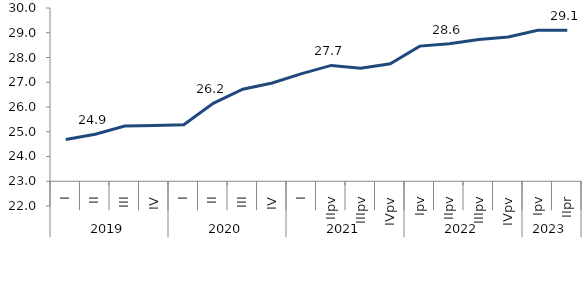
| Category | Series 0 |
|---|---|
| 0 | 24.69 |
| 1900-01-01 | 24.9 |
| 1900-01-02 | 25.23 |
| 1900-01-03 | 25.25 |
| 1900-01-04 | 25.28 |
| 1900-01-05 | 26.15 |
| 1900-01-06 | 26.72 |
| 1900-01-07 | 26.97 |
| 1900-01-08 | 27.35 |
| 1900-01-09 | 27.68 |
| 1900-01-10 | 27.57 |
| 1900-01-11 | 27.75 |
| 1900-01-12 | 28.46 |
| 1900-01-13 | 28.56 |
| 1900-01-14 | 28.73 |
| 1900-01-15 | 28.83 |
| 1900-01-16 | 29.1 |
| 1900-01-17 | 29.1 |